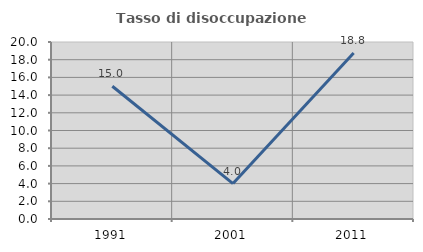
| Category | Tasso di disoccupazione giovanile  |
|---|---|
| 1991.0 | 15 |
| 2001.0 | 4 |
| 2011.0 | 18.75 |